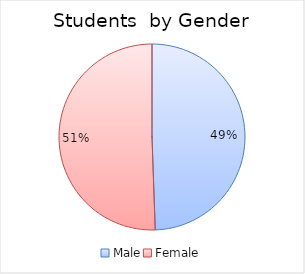
| Category | Series 0 |
|---|---|
| Male | 2059796 |
| Female | 2106159 |